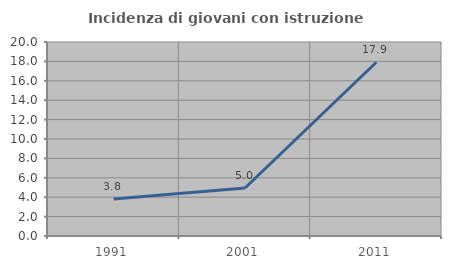
| Category | Incidenza di giovani con istruzione universitaria |
|---|---|
| 1991.0 | 3.81 |
| 2001.0 | 4.95 |
| 2011.0 | 17.91 |